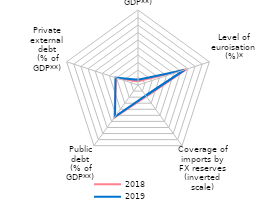
| Category | 2018 | 2019 |
|---|---|---|
| Current account deficit
(% of GDP**) | 4.8 | 6.9 |
| Level of
euroisation
(%)* | 67.8 | 64.9 |
| Coverage of imports by FX reserves
(inverted scale) | 18.7 | 17.4 |
| Public debt
(% of GDP**) | 53.7 | 52 |
| Private
external debt
(% of GDP**) | 30.8 | 31.6 |